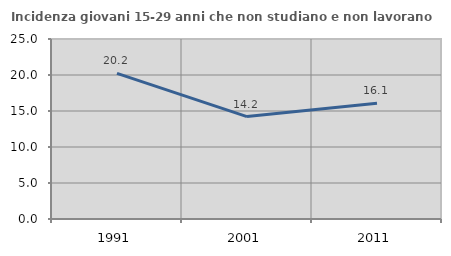
| Category | Incidenza giovani 15-29 anni che non studiano e non lavorano  |
|---|---|
| 1991.0 | 20.225 |
| 2001.0 | 14.222 |
| 2011.0 | 16.082 |